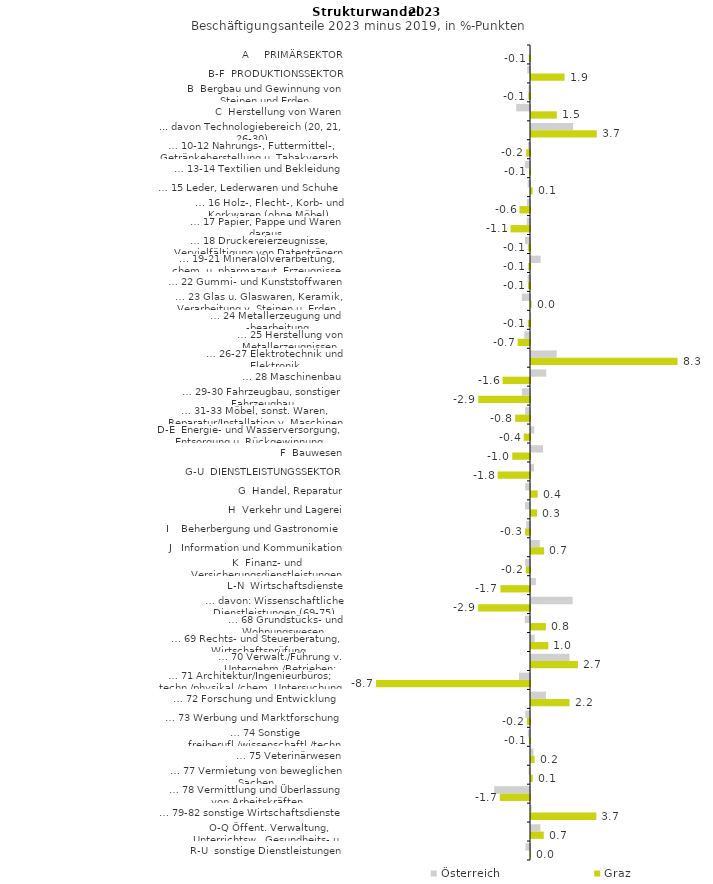
| Category | Österreich | Graz |
|---|---|---|
| A     PRIMÄRSEKTOR | -0.007 | -0.067 |
| B-F  PRODUKTIONSSEKTOR | -0.161 | 1.905 |
| B  Bergbau und Gewinnung von Steinen und Erden | -0.086 | -0.097 |
| C  Herstellung von Waren | -0.782 | 1.466 |
| ... davon Technologiebereich (20, 21, 26-30) | 2.393 | 3.736 |
| … 10-12 Nahrungs-, Futtermittel-, Getränkeherstellung u. Tabakverarb. | -0.116 | -0.215 |
| … 13-14 Textilien und Bekleidung | -0.289 | -0.053 |
| … 15 Leder, Lederwaren und Schuhe | -0.13 | 0.089 |
| … 16 Holz-, Flecht-, Korb- und Korkwaren (ohne Möbel)  | -0.177 | -0.596 |
| … 17 Papier, Pappe und Waren daraus  | -0.185 | -1.107 |
| … 18 Druckereierzeugnisse, Vervielfältigung von Datenträgern | -0.288 | -0.106 |
| … 19-21 Mineralölverarbeitung, chem. u. pharmazeut. Erzeugnisse | 0.549 | -0.092 |
| … 22 Gummi- und Kunststoffwaren | -0.139 | -0.115 |
| … 23 Glas u. Glaswaren, Keramik, Verarbeitung v. Steinen u. Erden  | -0.462 | 0.032 |
| … 24 Metallerzeugung und -bearbeitung | -0.032 | -0.124 |
| … 25 Herstellung von Metallerzeugnissen  | -0.325 | -0.704 |
| … 26-27 Elektrotechnik und Elektronik | 1.462 | 8.327 |
| … 28 Maschinenbau | 0.864 | -1.558 |
| … 29-30 Fahrzeugbau, sonstiger Fahrzeugbau | -0.462 | -2.939 |
| … 31-33 Möbel, sonst. Waren, Reparatur/Installation v. Maschinen | -0.273 | -0.839 |
| D-E  Energie- und Wasserversorgung, Entsorgung u. Rückgewinnung | 0.184 | -0.358 |
| F  Bauwesen | 0.684 | -1.009 |
| G-U  DIENSTLEISTUNGSSEKTOR | 0.167 | -1.838 |
| G  Handel, Reparatur | -0.273 | 0.379 |
| H  Verkehr und Lagerei | -0.287 | 0.342 |
| I    Beherbergung und Gastronomie | -0.218 | -0.275 |
| J   Information und Kommunikation | 0.499 | 0.746 |
| K  Finanz- und Versicherungsdienstleistungen | -0.279 | -0.24 |
| L-N  Wirtschaftsdienste | 0.279 | -1.679 |
| … davon: Wissenschaftliche Dienstleistungen (69-75) | 2.367 | -2.948 |
| … 68 Grundstücks- und Wohnungswesen  | -0.294 | 0.849 |
| … 69 Rechts- und Steuerberatung, Wirtschaftsprüfung | 0.205 | 0.984 |
| … 70 Verwalt./Führung v. Unternehm./Betrieben; Unternehmensberat. | 2.188 | 2.663 |
| … 71 Architektur/Ingenieurbüros; techn./physikal./chem. Untersuchung | -0.622 | -8.747 |
| … 72 Forschung und Entwicklung  | 0.854 | 2.189 |
| … 73 Werbung und Marktforschung | -0.273 | -0.174 |
| … 74 Sonstige freiberufl./wissenschaftl./techn. Tätigkeiten | -0.124 | -0.062 |
| … 75 Veterinärwesen | 0.14 | 0.202 |
| … 77 Vermietung von beweglichen Sachen  | -0.077 | 0.099 |
| … 78 Vermittlung und Überlassung von Arbeitskräften | -2.035 | -1.719 |
| … 79-82 sonstige Wirtschaftsdienste | 0.039 | 3.713 |
| O-Q Öffent. Verwaltung, Unterrichtsw., Gesundheits- u. Sozialwesen | 0.535 | 0.725 |
| R-U  sonstige Dienstleistungen | -0.256 | 0.003 |